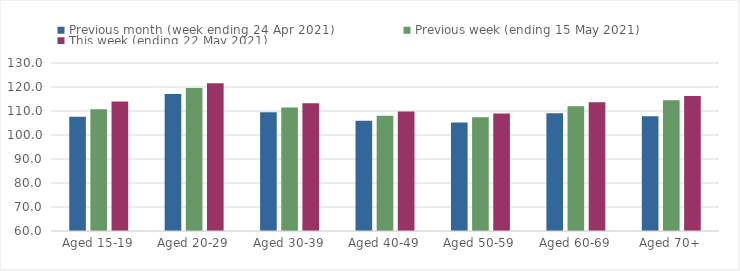
| Category | Previous month (week ending 24 Apr 2021) | Previous week (ending 15 May 2021) | This week (ending 22 May 2021) |
|---|---|---|---|
| Aged 15-19 | 107.58 | 110.71 | 113.96 |
| Aged 20-29 | 117.1 | 119.6 | 121.52 |
| Aged 30-39 | 109.43 | 111.44 | 113.21 |
| Aged 40-49 | 105.95 | 108.04 | 109.8 |
| Aged 50-59 | 105.19 | 107.4 | 109 |
| Aged 60-69 | 109.02 | 111.95 | 113.63 |
| Aged 70+ | 107.79 | 114.43 | 116.24 |